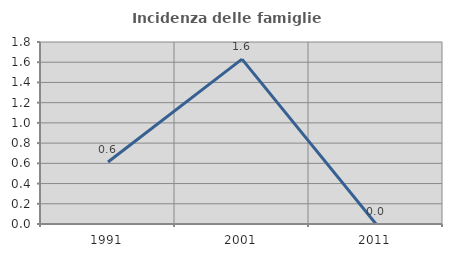
| Category | Incidenza delle famiglie numerose |
|---|---|
| 1991.0 | 0.613 |
| 2001.0 | 1.63 |
| 2011.0 | 0 |